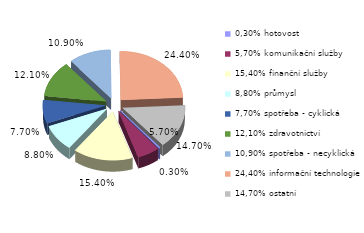
| Category | Series 0 |
|---|---|
| 0,30% hotovost | 0.003 |
| 5,70% komunikační služby | 0.057 |
| 15,40% finanční služby | 0.154 |
| 8,80% průmysl | 0.088 |
| 7,70% spotřeba - cyklická | 0.077 |
| 12,10% zdravotnictví | 0.121 |
| 10,90% spotřeba - necyklická | 0.109 |
| 24,40% informační technologie | 0.244 |
| 14,70% ostatní | 0.147 |